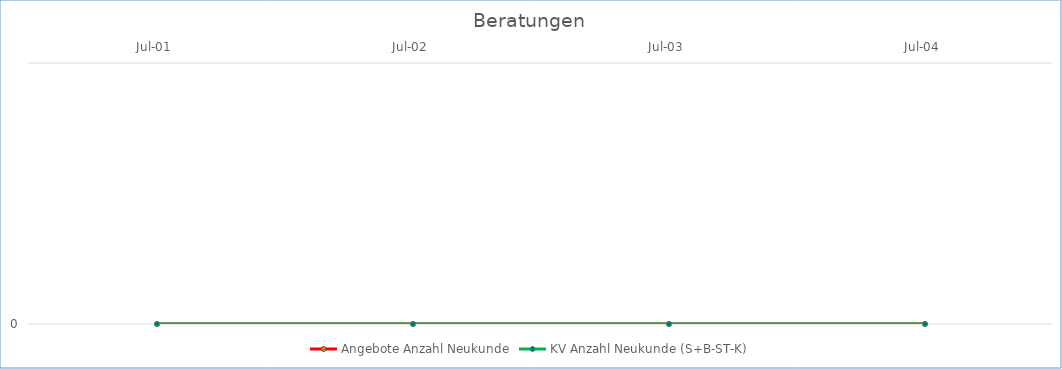
| Category | Angebote Anzahl Neukunde | KV Anzahl Neukunde (S+B-ST-K) |
|---|---|---|
| 2001-07-01 | 0 | 0 |
| 2002-07-01 | 0 | 0 |
| 2003-07-01 | 0 | 0 |
| 2004-07-01 | 0 | 0 |